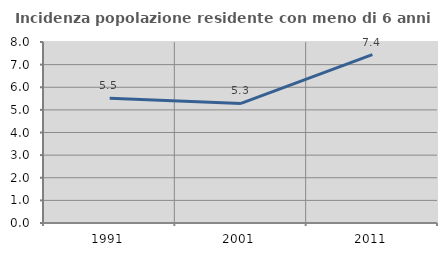
| Category | Incidenza popolazione residente con meno di 6 anni |
|---|---|
| 1991.0 | 5.517 |
| 2001.0 | 5.286 |
| 2011.0 | 7.443 |